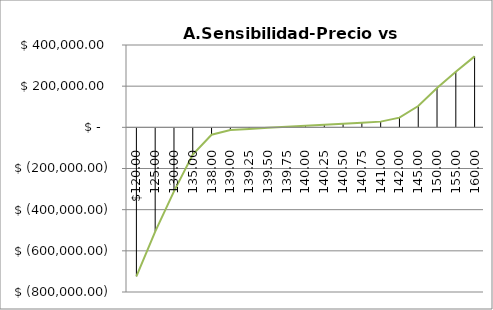
| Category | Series 1 |
|---|---|
| 120.0 | -724039.07 |
| 125.0 | -507035.54 |
| 130.0 | -310836.08 |
| 135.0 | -132093.72 |
| 138.0 | -36004.6 |
| 139.0 | -13518.01 |
| 139.25 | -8021.75 |
| 139.5 | -2545.11 |
| 139.75 | 2911.89 |
| 140.0 | 8063.14 |
| 140.25 | 13000.17 |
| 140.5 | 17919.63 |
| 140.75 | 22821.61 |
| 141.0 | 27706.21 |
| 142.0 | 47072.62 |
| 145.0 | 103569.1 |
| 150.0 | 190701.5 |
| 155.0 | 270239.35 |
| 160.0 | 344806.08 |